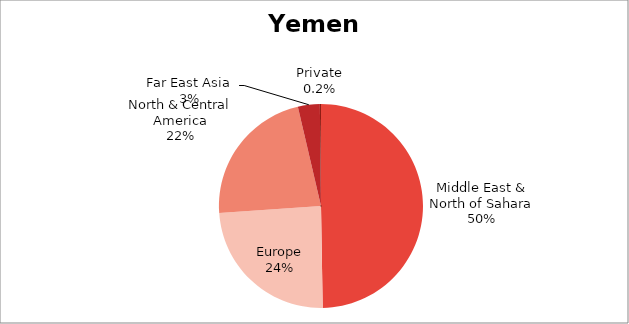
| Category | US$ millions |
|---|---|
| Middle East & North of Sahara | 805.409 |
| Europe | 391.511 |
| North & Central America | 363.416 |
| Far East Asia | 56.179 |
| Private | 2.885 |